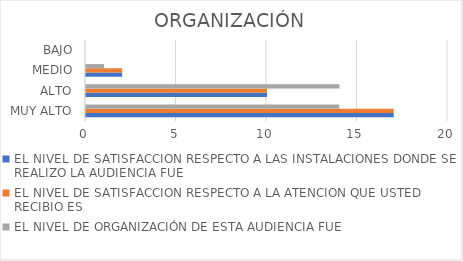
| Category | EL NIVEL DE SATISFACCION RESPECTO A LAS INSTALACIONES DONDE SE REALIZO LA AUDIENCIA FUE | EL NIVEL DE SATISFACCION RESPECTO A LA ATENCION QUE USTED RECIBIO ES | EL NIVEL DE ORGANIZACIÓN DE ESTA AUDIENCIA FUE |
|---|---|---|---|
| MUY ALTO | 17 | 17 | 14 |
| ALTO | 10 | 10 | 14 |
| MEDIO | 2 | 2 | 1 |
| BAJO | 0 | 0 | 0 |